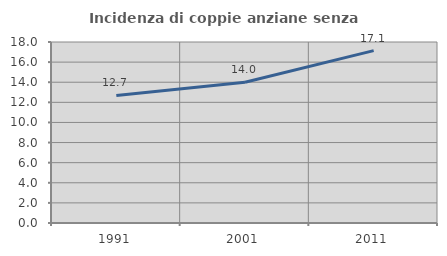
| Category | Incidenza di coppie anziane senza figli  |
|---|---|
| 1991.0 | 12.681 |
| 2001.0 | 14.004 |
| 2011.0 | 17.143 |